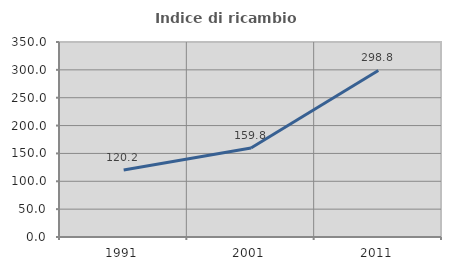
| Category | Indice di ricambio occupazionale  |
|---|---|
| 1991.0 | 120.212 |
| 2001.0 | 159.754 |
| 2011.0 | 298.849 |